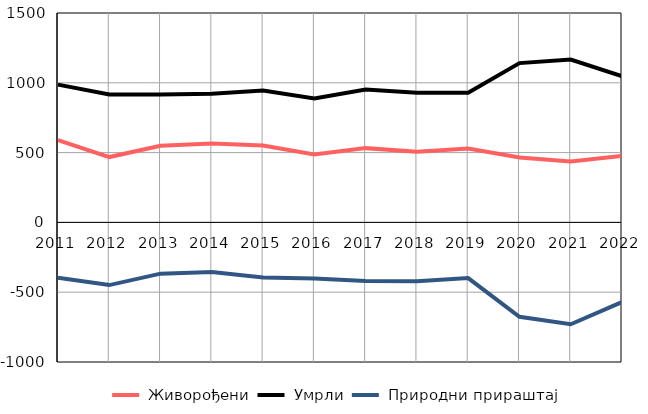
| Category |  Живорођени |  Умрли |  Природни прираштај |
|---|---|---|---|
| 2011.0 | 590 | 987 | -397 |
| 2012.0 | 468 | 917 | -449 |
| 2013.0 | 549 | 916 | -367 |
| 2014.0 | 566 | 921 | -355 |
| 2015.0 | 551 | 945 | -394 |
| 2016.0 | 486 | 887 | -401 |
| 2017.0 | 532 | 952 | -420 |
| 2018.0 | 507 | 928 | -421 |
| 2019.0 | 529 | 928 | -399 |
| 2020.0 | 465 | 1141 | -676 |
| 2021.0 | 436 | 1166 | -730 |
| 2022.0 | 477 | 1048 | -571 |